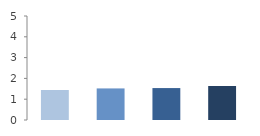
| Category | Rate (%) |
|---|---|
| 2009.0 | 1.443 |
| 2010.0 | 1.518 |
| 2011.0 | 1.535 |
| 2012.0 | 1.635 |